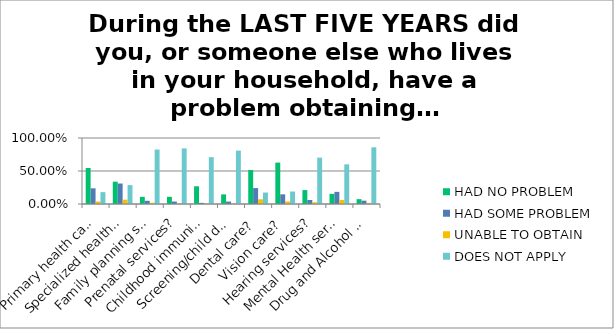
| Category | HAD NO PROBLEM | HAD SOME PROBLEM | UNABLE TO OBTAIN | DOES NOT APPLY |
|---|---|---|---|---|
| Primary health care? | 0.546 | 0.238 | 0.037 | 0.179 |
| Specialized health care? | 0.338 | 0.31 | 0.065 | 0.286 |
| Family planning services? | 0.108 | 0.048 | 0.019 | 0.825 |
| Prenatal services? | 0.108 | 0.037 | 0.012 | 0.842 |
| Childhood immunizations? | 0.268 | 0.017 | 0.005 | 0.71 |
| Screening/child development services for children 5 and under? | 0.146 | 0.036 | 0.009 | 0.809 |
| Dental care? | 0.515 | 0.241 | 0.071 | 0.174 |
| Vision care? | 0.627 | 0.146 | 0.037 | 0.189 |
| Hearing services? | 0.211 | 0.06 | 0.026 | 0.702 |
| Mental Health services? | 0.154 | 0.184 | 0.061 | 0.601 |
| Drug and Alcohol services? | 0.074 | 0.05 | 0.017 | 0.859 |